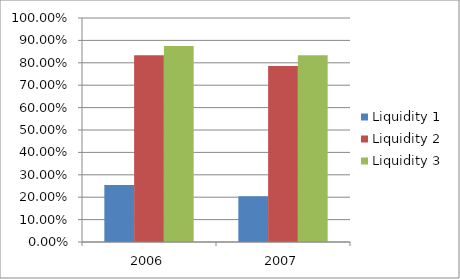
| Category | Liquidity 1 | Liquidity 2 | Liquidity 3 |
|---|---|---|---|
| 2006.0 | 0.255 | 0.834 | 0.875 |
| 2007.0 | 0.204 | 0.786 | 0.833 |